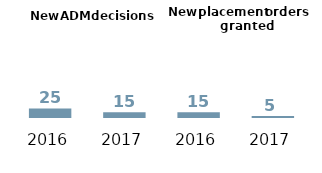
| Category | LA |
|---|---|
| 2016.0 | 25 |
| 2017.0 | 15 |
| 2016.0 | 15 |
| 2017.0 | 5 |